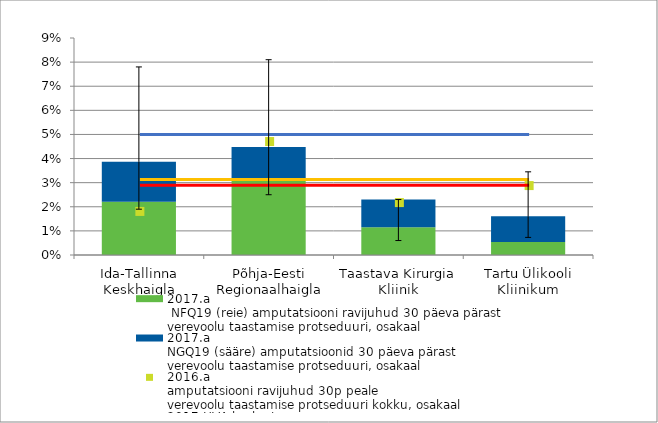
| Category | 2017.a 
 NFQ19 (reie) amputatsiooni ravijuhud 30 päeva pärast
verevoolu taastamise protseduuri, osakaal | 2017.a
NGQ19 (sääre) amputatsioonid 30 päeva pärast
verevoolu taastamise protseduuri, osakaal |
|---|---|---|
| Ida-Tallinna Keskhaigla | 0.022 | 0.017 |
| Põhja-Eesti Regionaalhaigla | 0.031 | 0.013 |
| Taastava Kirurgia Kliinik | 0.011 | 0.011 |
| Tartu Ülikooli Kliinikum | 0.005 | 0.011 |